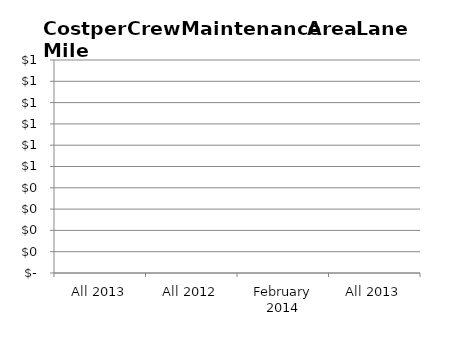
| Category |    Cost per Maintenance Area Lane Mile |
|---|---|
| All 2013 | 0 |
| All 2012 | 0 |
| February 2014 | 0 |
| All 2013 | 0 |